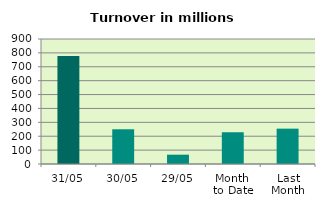
| Category | Series 0 |
|---|---|
| 31/05 | 778.19 |
| 30/05 | 250.066 |
| 29/05 | 67.145 |
| Month 
to Date | 228.645 |
| Last
Month | 254.458 |